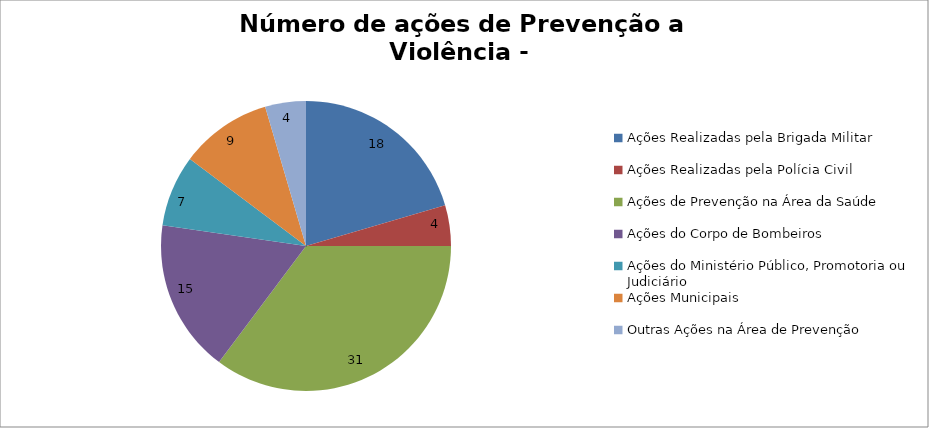
| Category | Número de Ações |
|---|---|
| Ações Realizadas pela Brigada Militar | 18 |
| Ações Realizadas pela Polícia Civil | 4 |
| Ações de Prevenção na Área da Saúde | 31 |
| Ações do Corpo de Bombeiros | 15 |
| Ações do Ministério Público, Promotoria ou Judiciário | 7 |
| Ações Municipais | 9 |
| Outras Ações na Área de Prevenção | 4 |